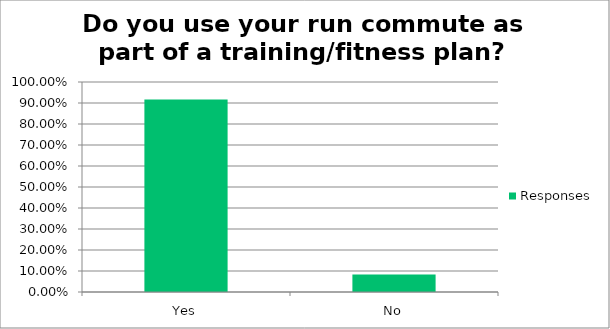
| Category | Responses |
|---|---|
| Yes | 0.916 |
| No | 0.084 |